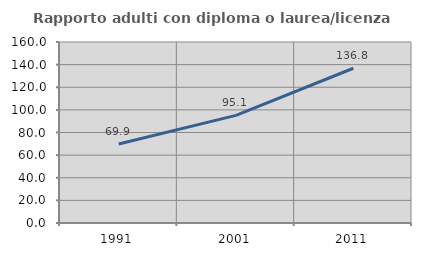
| Category | Rapporto adulti con diploma o laurea/licenza media  |
|---|---|
| 1991.0 | 69.881 |
| 2001.0 | 95.139 |
| 2011.0 | 136.783 |